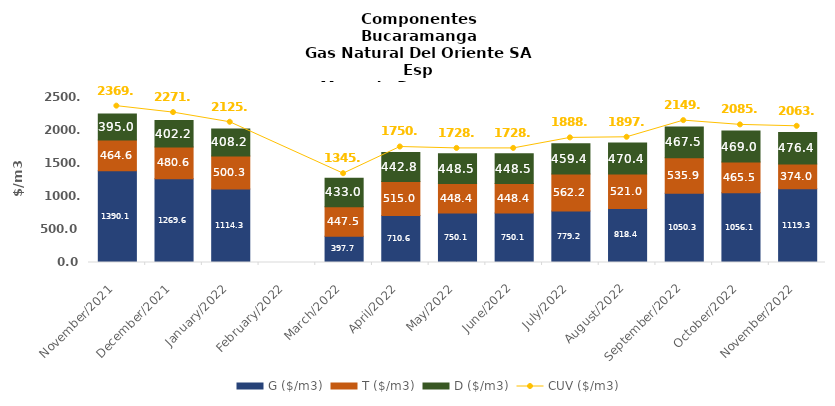
| Category | G ($/m3) | T ($/m3) | D ($/m3) |
|---|---|---|---|
| 2021-11-01 | 1390.06 | 464.56 | 395.01 |
| 2021-12-01 | 1269.62 | 480.62 | 402.17 |
| 2022-01-01 | 1114.28 | 500.33 | 408.24 |
| 2022-03-01 | 397.74 | 447.53 | 433 |
| 2022-04-01 | 710.63 | 514.96 | 442.77 |
| 2022-05-01 | 750.14 | 448.38 | 448.47 |
| 2022-06-01 | 750.14 | 448.38 | 448.47 |
| 2022-07-01 | 779.21 | 562.18 | 459.39 |
| 2022-08-01 | 818.35 | 520.99 | 470.4 |
| 2022-09-01 | 1050.31 | 535.9 | 467.52 |
| 2022-10-01 | 1056.07 | 465.54 | 469.03 |
| 2022-11-01 | 1119.25 | 374.03 | 476.36 |